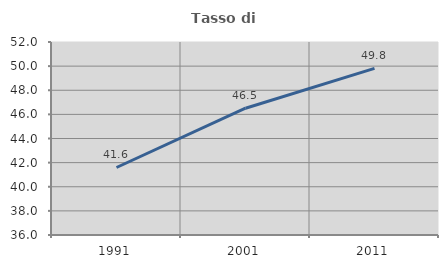
| Category | Tasso di occupazione   |
|---|---|
| 1991.0 | 41.597 |
| 2001.0 | 46.512 |
| 2011.0 | 49.815 |